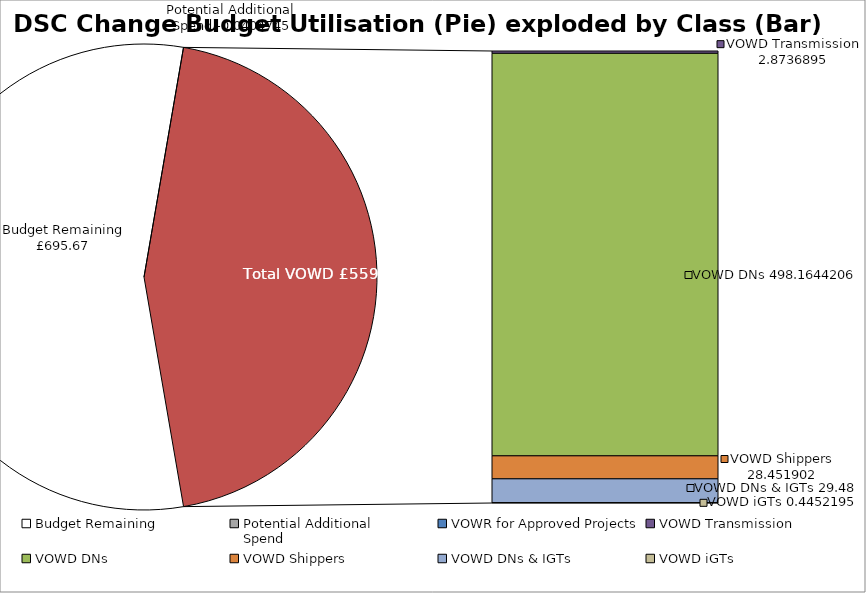
| Category | Series 0 |
|---|---|
| Budget Remaining | 695.666 |
| Potential Additional 
Spend | -0.04 |
| VOWR for Approved Projects | 0 |
| VOWD Transmission | 2.874 |
| VOWD DNs | 498.164 |
| VOWD Shippers | 28.452 |
| VOWD DNs & IGTs | 29.48 |
| VOWD iGTs | 0.445 |